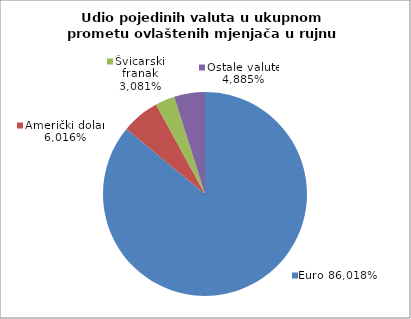
| Category | EUR |
|---|---|
| 0 | 0.86 |
| 1 | 0.06 |
| 2 | 0.031 |
| 3 | 0.049 |